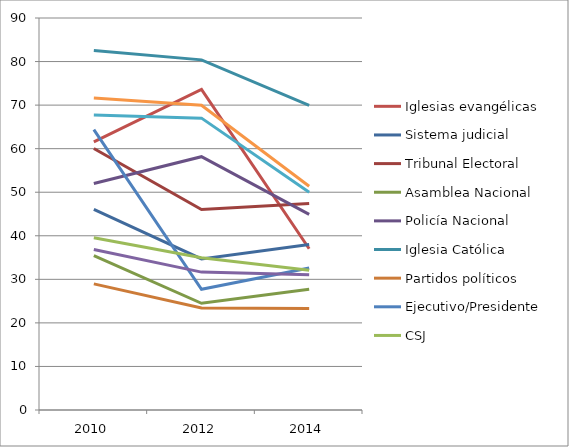
| Category | Iglesias evangélicas | Sistema judicial | Tribunal Electoral | Asamblea Nacional | Policía Nacional | Iglesia Católica | Partidos políticos | Ejecutivo/Presidente | CSJ | Municipalidad | Medio de comunicación | Canal de Panama |
|---|---|---|---|---|---|---|---|---|---|---|---|---|
| 2010.0 | 61.55 | 46.05 | 60.05 | 35.44 | 51.99 | 82.53 | 28.96 | 64.36 | 39.54 | 36.86 | 67.74 | 71.65 |
| 2012.0 | 73.61 | 34.7 | 46.02 | 24.49 | 58.16 | 80.39 | 23.42 | 27.73 | 34.95 | 31.66 | 67.01 | 69.98 |
| 2014.0 | 37.02 | 37.99 | 47.43 | 27.71 | 44.91 | 69.94 | 23.28 | 32.58 | 32.07 | 31.08 | 49.97 | 51.38 |